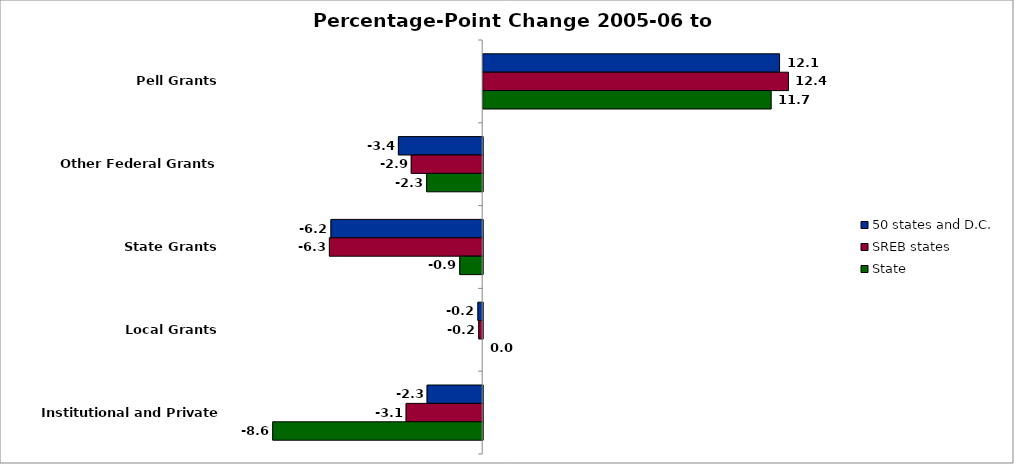
| Category | 50 states and D.C. | SREB states | State |
|---|---|---|---|
| Pell Grants | 12.087 | 12.449 | 11.745 |
| Other Federal Grants | -3.438 | -2.914 | -2.286 |
| State Grants | -6.188 | -6.252 | -0.935 |
| Local Grants | -0.194 | -0.161 | 0 |
| Institutional and Private Grants | -2.267 | -3.122 | -8.563 |